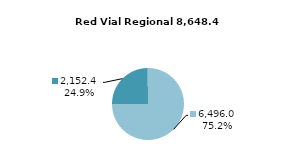
| Category | RV Departamental |
|---|---|
| Pavimentada | 2152.39 |
| No Pavimentada | 6495.976 |